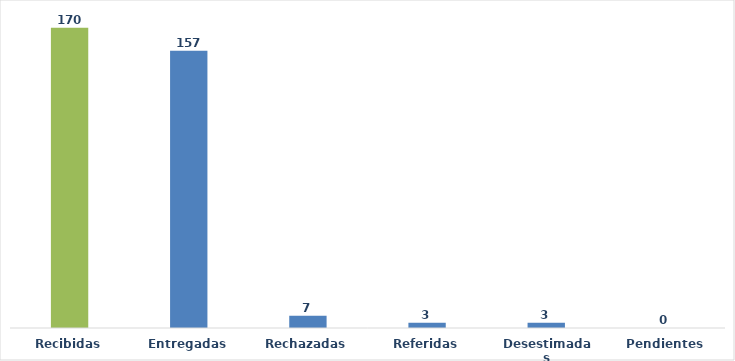
| Category | Series 0 |
|---|---|
| Recibidas | 170 |
| Entregadas | 157 |
| Rechazadas | 7 |
| Referidas | 3 |
| Desestimadas | 3 |
| Pendientes | 0 |